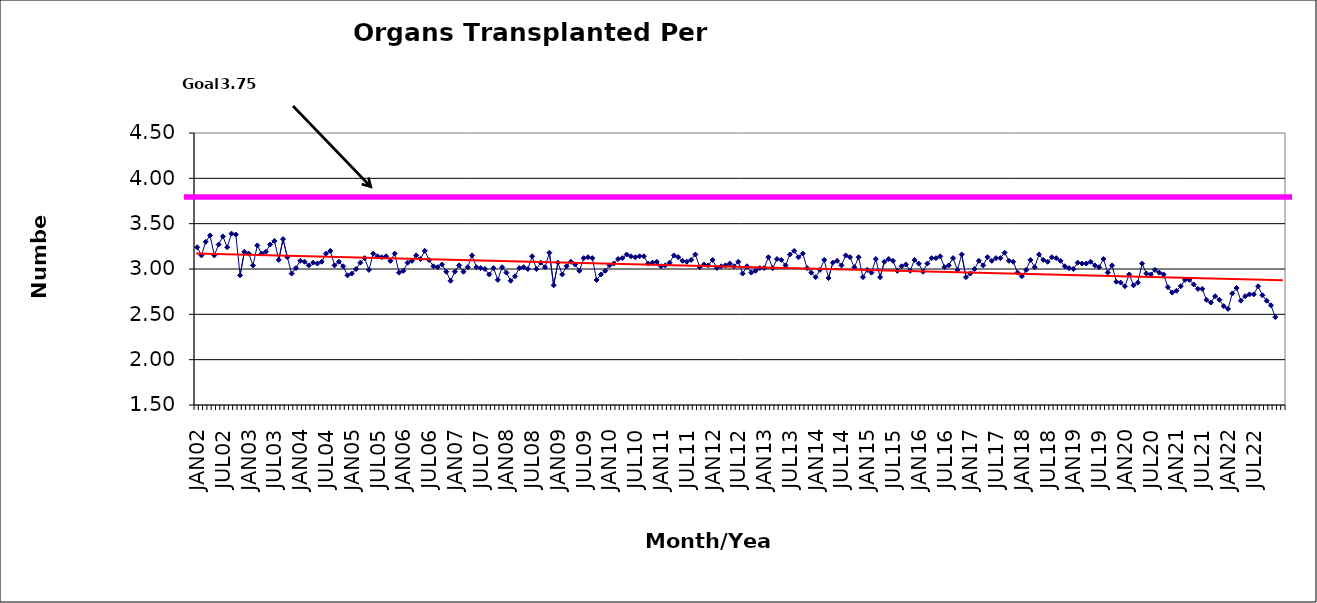
| Category | Series 0 |
|---|---|
| JAN02 | 3.24 |
| FEB02 | 3.15 |
| MAR02 | 3.3 |
| APR02 | 3.37 |
| MAY02 | 3.15 |
| JUN02 | 3.27 |
| JUL02 | 3.36 |
| AUG02 | 3.24 |
| SEP02 | 3.39 |
| OCT02 | 3.38 |
| NOV02 | 2.93 |
| DEC02 | 3.19 |
| JAN03 | 3.17 |
| FEB03 | 3.04 |
| MAR03 | 3.26 |
| APR03 | 3.17 |
| MAY03 | 3.19 |
| JUN03 | 3.27 |
| JUL03 | 3.31 |
| AUG03 | 3.1 |
| SEP03 | 3.33 |
| OCT03 | 3.13 |
| NOV03 | 2.95 |
| DEC03 | 3.01 |
| JAN04 | 3.09 |
| FEB04 | 3.08 |
| MAR04 | 3.04 |
| APR04 | 3.07 |
| MAY04 | 3.06 |
| JUN04 | 3.08 |
| JUL04 | 3.17 |
| AUG04 | 3.2 |
| SEP04 | 3.04 |
| OCT04 | 3.08 |
| NOV04 | 3.03 |
| DEC04 | 2.93 |
| JAN05 | 2.95 |
| FEB05 | 3 |
| MAR05 | 3.07 |
| APR05 | 3.12 |
| MAY05 | 2.99 |
| JUN05 | 3.17 |
| JUL05 | 3.14 |
| AUG05 | 3.13 |
| SEP05 | 3.14 |
| OCT05 | 3.09 |
| NOV05 | 3.17 |
| DEC05 | 2.96 |
| JAN06 | 2.98 |
| FEB06 | 3.07 |
| MAR06 | 3.09 |
| APR06 | 3.15 |
| MAY06 | 3.11 |
| JUN06 | 3.2 |
| JUL06 | 3.1 |
| AUG06 | 3.03 |
| SEP06 | 3.02 |
| OCT06 | 3.05 |
| NOV06 | 2.97 |
| DEC06 | 2.87 |
| JAN07 | 2.97 |
| FEB07 | 3.04 |
| MAR07 | 2.97 |
| APR07 | 3.02 |
| MAY07 | 3.15 |
| JUN07 | 3.02 |
| JUL07 | 3.01 |
| AUG07 | 3 |
| SEP07 | 2.94 |
| OCT07 | 3.01 |
| NOV07 | 2.88 |
| DEC07 | 3.02 |
| JAN08 | 2.96 |
| FEB08 | 2.87 |
| MAR08 | 2.92 |
| APR08 | 3.01 |
| MAY08 | 3.02 |
| JUN08 | 3 |
| JUL08 | 3.14 |
| AUG08 | 3 |
| SEP08 | 3.07 |
| OCT08 | 3.02 |
| NOV08 | 3.18 |
| DEC08 | 2.82 |
| JAN09 | 3.07 |
| FEB09 | 2.94 |
| MAR09 | 3.03 |
| APR09 | 3.08 |
| MAY09 | 3.05 |
| JUN09 | 2.98 |
| JUL09 | 3.12 |
| AUG09 | 3.13 |
| SEP09 | 3.12 |
| OCT09 | 2.88 |
| NOV09 | 2.94 |
| DEC09 | 2.98 |
| JAN10 | 3.04 |
| FEB10 | 3.06 |
| MAR10 | 3.11 |
| APR10 | 3.12 |
| MAY10 | 3.16 |
| JUN10 | 3.14 |
| JUL10 | 3.13 |
| AUG10 | 3.14 |
| SEP10 | 3.14 |
| OCT10 | 3.06 |
| NOV10 | 3.07 |
| DEC10 | 3.08 |
| JAN11 | 3.03 |
| FEB11 | 3.04 |
| MAR11 | 3.07 |
| APR11 | 3.15 |
| MAY11 | 3.13 |
| JUN11 | 3.09 |
| JUL11 | 3.08 |
| AUG11 | 3.1 |
| SEP11 | 3.16 |
| OCT11 | 3.02 |
| NOV11 | 3.05 |
| DEC11 | 3.04 |
| JAN12 | 3.1 |
| FEB12 | 3.01 |
| MAR12 | 3.03 |
| APR12 | 3.04 |
| MAY12 | 3.06 |
| JUN12 | 3.03 |
| JUL12 | 3.08 |
| AUG12 | 2.95 |
| SEP12 | 3.03 |
| OCT12 | 2.96 |
| NOV12 | 2.98 |
| DEC12 | 3.01 |
| JAN13 | 3.01 |
| FEB13 | 3.13 |
| MAR13 | 3.01 |
| APR13 | 3.11 |
| MAY13 | 3.1 |
| JUN13 | 3.04 |
| JUL13 | 3.16 |
| AUG13 | 3.2 |
| SEP13 | 3.13 |
| OCT13 | 3.17 |
| NOV13 | 3.01 |
| DEC13 | 2.96 |
| JAN14 | 2.91 |
| FEB14 | 2.99 |
| MAR14 | 3.1 |
| APR14 | 2.9 |
| MAY14 | 3.07 |
| JUN14 | 3.09 |
| JUL14 | 3.04 |
| AUG14 | 3.15 |
| SEP14 | 3.13 |
| OCT14 | 3.02 |
| NOV14 | 3.13 |
| DEC14 | 2.91 |
| JAN15 | 2.99 |
| FEB15 | 2.96 |
| MAR15 | 3.11 |
| APR15 | 2.91 |
| MAY15 | 3.08 |
| JUN15 | 3.11 |
| JUL15 | 3.09 |
| AUG15 | 2.98 |
| SEP15 | 3.03 |
| OCT15 | 3.05 |
| NOV15 | 2.98 |
| DEC15 | 3.1 |
| JAN16 | 3.06 |
| FEB16 | 2.97 |
| MAR16 | 3.06 |
| APR16 | 3.12 |
| MAY16 | 3.12 |
| JUN16 | 3.14 |
| JUL16 | 3.02 |
| AUG16 | 3.04 |
| SEP16 | 3.12 |
| OCT16 | 2.99 |
| NOV16 | 3.16 |
| DEC16 | 2.91 |
| JAN17 | 2.95 |
| FEB17 | 3 |
| MAR17 | 3.09 |
| APR17 | 3.04 |
| MAY17 | 3.13 |
| JUN17 | 3.09 |
| JUL17 | 3.12 |
| AUG17 | 3.12 |
| SEP17 | 3.18 |
| OCT17 | 3.09 |
| NOV17 | 3.08 |
| DEC17 | 2.96 |
| JAN18 | 2.92 |
| FEB18 | 2.99 |
| MAR18 | 3.1 |
| APR18 | 3.02 |
| MAY18 | 3.16 |
| JUN18 | 3.1 |
| JUL18 | 3.08 |
| AUG18 | 3.13 |
| SEP18 | 3.12 |
| OCT18 | 3.09 |
| NOV18 | 3.03 |
| DEC18 | 3.01 |
| JAN19 | 3 |
| FEB19 | 3.07 |
| MAR19 | 3.06 |
| APR19 | 3.06 |
| MAY19 | 3.08 |
| JUN19 | 3.04 |
| JUL19 | 3.02 |
| AUG19 | 3.11 |
| SEP19 | 2.96 |
| OCT19 | 3.04 |
| NOV19 | 2.86 |
| DEC19 | 2.85 |
| JAN20 | 2.81 |
| FEB20 | 2.94 |
| MAR20 | 2.82 |
| APR20 | 2.85 |
| MAY20 | 3.06 |
| JUN20 | 2.95 |
| JUL20 | 2.94 |
| AUG20 | 2.99 |
| SEP20 | 2.96 |
| OCT20 | 2.94 |
| NOV20 | 2.8 |
| DEC20 | 2.74 |
| JAN21 | 2.76 |
| FEB21 | 2.81 |
| MAR21 | 2.88 |
| APR21 | 2.88 |
| MAY21 | 2.83 |
| JUN21 | 2.78 |
| JUL21 | 2.78 |
| AUG21 | 2.66 |
| SEP21 | 2.63 |
| OCT21 | 2.7 |
| NOV21 | 2.66 |
| DEC21 | 2.59 |
| JAN22 | 2.56 |
| FEB22 | 2.73 |
| MAR22 | 2.79 |
| APR22 | 2.65 |
| MAY22 | 2.7 |
| JUN22 | 2.72 |
| JUL22 | 2.72 |
| AUG22 | 2.81 |
| SEP22 | 2.71 |
| OCT22 | 2.65 |
| NOV22 | 2.6 |
| DEC22 | 2.47 |